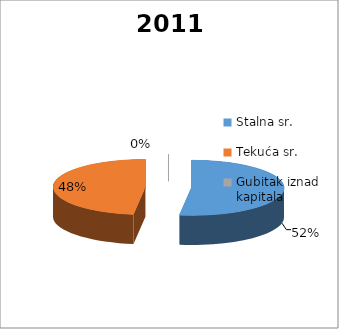
| Category | 2011 |
|---|---|
| Stalna sr. | 1340752 |
| Tekuća sr. | 1234858 |
| Gubitak iznad kapitala | 0 |